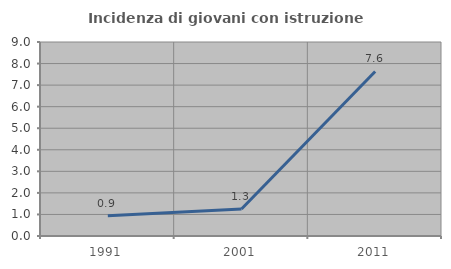
| Category | Incidenza di giovani con istruzione universitaria |
|---|---|
| 1991.0 | 0.943 |
| 2001.0 | 1.25 |
| 2011.0 | 7.634 |